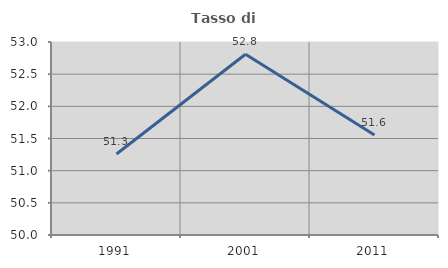
| Category | Tasso di occupazione   |
|---|---|
| 1991.0 | 51.26 |
| 2001.0 | 52.809 |
| 2011.0 | 51.553 |